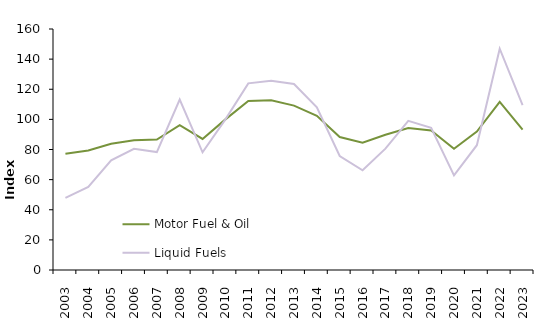
| Category | Motor Fuel & Oil | Liquid Fuels |
|---|---|---|
| 2003.0 | 77.142 | 47.925 |
| 2004.0 | 79.358 | 55.122 |
| 2005.0 | 83.826 | 72.751 |
| 2006.0 | 86.066 | 80.464 |
| 2007.0 | 86.58 | 78.303 |
| 2008.0 | 96.198 | 113.155 |
| 2009.0 | 87.008 | 78.128 |
| 2010.0 | 100 | 100 |
| 2011.0 | 112.204 | 123.906 |
| 2012.0 | 112.677 | 125.717 |
| 2013.0 | 109.146 | 123.47 |
| 2014.0 | 102.388 | 108.072 |
| 2015.0 | 88.302 | 75.667 |
| 2016.0 | 84.538 | 66.206 |
| 2017.0 | 89.754 | 80.553 |
| 2018.0 | 94.278 | 99.018 |
| 2019.0 | 92.624 | 94.419 |
| 2020.0 | 80.514 | 62.8 |
| 2021.0 | 91.87 | 82.857 |
| 2022.0 | 111.643 | 146.894 |
| 2023.0 | 93.21 | 109.455 |